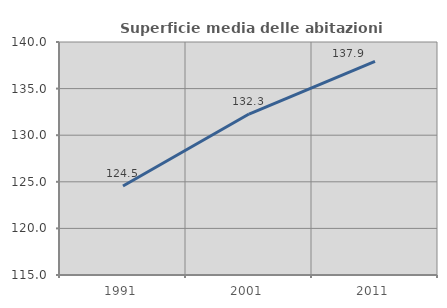
| Category | Superficie media delle abitazioni occupate |
|---|---|
| 1991.0 | 124.549 |
| 2001.0 | 132.271 |
| 2011.0 | 137.912 |